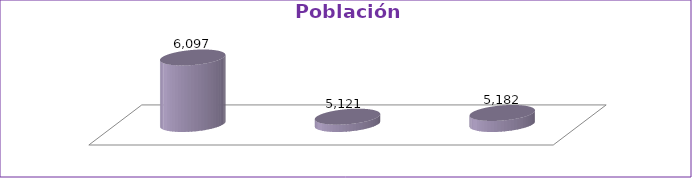
| Category | Población Total |
|---|---|
| 1993 | 6097 |
| 2005 | 5121 |
| 2016 | 5182 |